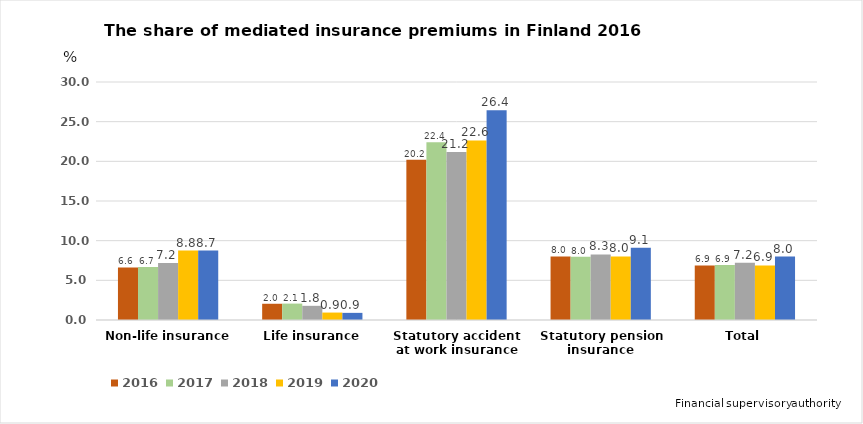
| Category | 2016 | 2017 | 2018 | 2019 | 2020 |
|---|---|---|---|---|---|
| Non-life insurance | 6.621 | 6.681 | 7.184 | 8.751 | 8.75 |
| Life insurance | 2.047 | 2.067 | 1.786 | 0.938 | 0.899 |
| Statutory accident at work insurance | 20.194 | 22.408 | 21.186 | 22.632 | 26.436 |
| Statutory pension insurance | 8.016 | 7.982 | 8.268 | 8.015 | 9.101 |
| Total | 6.875 | 6.948 | 7.208 | 6.878 | 8 |